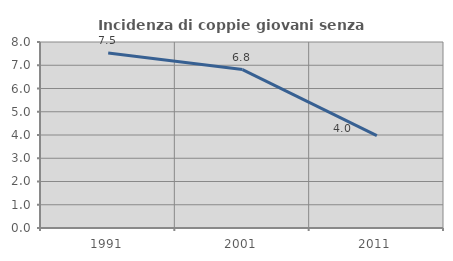
| Category | Incidenza di coppie giovani senza figli |
|---|---|
| 1991.0 | 7.53 |
| 2001.0 | 6.814 |
| 2011.0 | 3.971 |